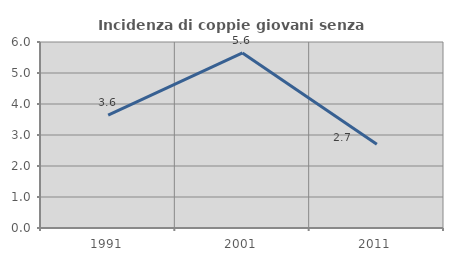
| Category | Incidenza di coppie giovani senza figli |
|---|---|
| 1991.0 | 3.644 |
| 2001.0 | 5.648 |
| 2011.0 | 2.699 |